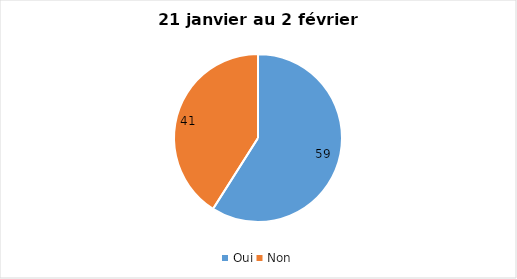
| Category | 21 janvier au 2 février 2022 |
|---|---|
| Oui | 59 |
| Non | 41 |